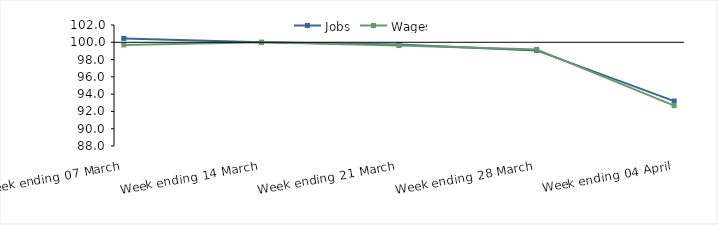
| Category | Jobs | Wages |
|---|---|---|
| 0 | 100.446 | 99.695 |
| 1900-01-01 | 100 | 100 |
| 1900-01-02 | 99.73 | 99.623 |
| 1900-01-03 | 99.06 | 99.179 |
| 1900-01-04 | 93.199 | 92.667 |